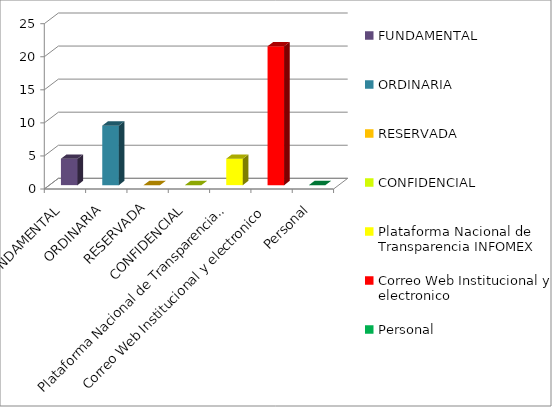
| Category | Series 2 |
|---|---|
| FUNDAMENTAL | 4 |
| ORDINARIA | 9 |
| RESERVADA | 0 |
| CONFIDENCIAL | 0 |
| Plataforma Nacional de Transparencia INFOMEX | 4 |
| Correo Web Institucional y electronico | 21 |
| Personal | 0 |